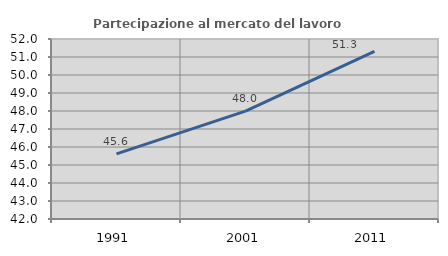
| Category | Partecipazione al mercato del lavoro  femminile |
|---|---|
| 1991.0 | 45.619 |
| 2001.0 | 47.994 |
| 2011.0 | 51.308 |